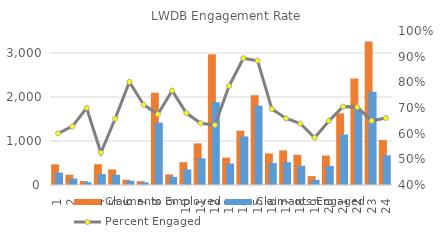
| Category | Claimants Employed | Claimants Engaged |
|---|---|---|
| 1.0 | 469 | 282 |
| 2.0 | 234 | 147 |
| 3.0 | 90 | 63 |
| 4.0 | 472 | 248 |
| 5.0 | 354 | 233 |
| 6.0 | 121 | 97 |
| 7.0 | 87 | 62 |
| 8.0 | 2098 | 1418 |
| 9.0 | 241 | 185 |
| 10.0 | 519 | 353 |
| 11.0 | 946 | 606 |
| 12.0 | 2970 | 1882 |
| 13.0 | 621 | 488 |
| 14.0 | 1236 | 1105 |
| 15.0 | 2039 | 1803 |
| 16.0 | 717 | 499 |
| 17.0 | 787 | 519 |
| 18.0 | 685 | 438 |
| 19.0 | 202 | 118 |
| 20.0 | 670 | 435 |
| 21.0 | 1629 | 1149 |
| 22.0 | 2422 | 1704 |
| 23.0 | 3264 | 2122 |
| 24.0 | 1021 | 675 |